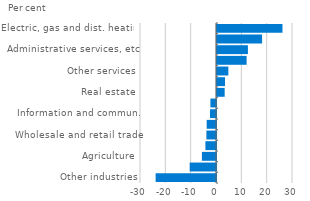
| Category | Series 0 |
|---|---|
| Other industries | -23.83 |
| Culture and entertain., etc. | -10.39 |
| Agriculture | -5.569 |
| Healthcare, etc. | -4.182 |
| Wholesale and retail trade | -3.798 |
| Liberal services, etc. | -3.683 |
| Information and commun. | -2.376 |
| Hotels and restaurants | -2.211 |
| Real estate | 3.026 |
| Construction | 3.157 |
| Other services | 4.479 |
| Transportation and goods | 11.692 |
| Administrative services, etc. | 12.204 |
| Manufacturing | 17.793 |
| Electric, gas and dist. heating | 25.844 |